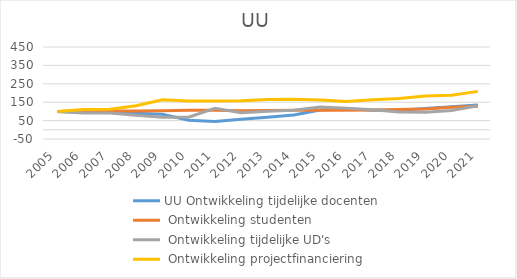
| Category | UU |
|---|---|
| 2005.0 | 100 |
| 2006.0 | 110.006 |
| 2007.0 | 111.742 |
| 2008.0 | 130.669 |
| 2009.0 | 162.641 |
| 2010.0 | 156.179 |
| 2011.0 | 157.088 |
| 2012.0 | 157.868 |
| 2013.0 | 164.535 |
| 2014.0 | 166.465 |
| 2015.0 | 161.775 |
| 2016.0 | 154.145 |
| 2017.0 | 163.959 |
| 2018.0 | 170.034 |
| 2019.0 | 183.909 |
| 2020.0 | 187.608 |
| 2021.0 | 208.787 |